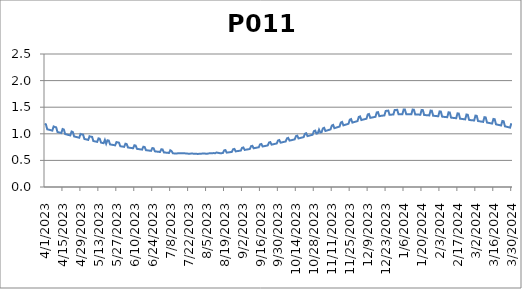
| Category | P011 |
|---|---|
| 4/1/23 | 1.185 |
| 4/2/23 | 1.178 |
| 4/3/23 | 1.085 |
| 4/4/23 | 1.079 |
| 4/5/23 | 1.073 |
| 4/6/23 | 1.066 |
| 4/7/23 | 1.06 |
| 4/8/23 | 1.138 |
| 4/9/23 | 1.128 |
| 4/10/23 | 1.121 |
| 4/11/23 | 1.034 |
| 4/12/23 | 1.028 |
| 4/13/23 | 1.021 |
| 4/14/23 | 1.015 |
| 4/15/23 | 1.09 |
| 4/16/23 | 1.08 |
| 4/17/23 | 0.995 |
| 4/18/23 | 0.989 |
| 4/19/23 | 0.982 |
| 4/20/23 | 0.976 |
| 4/21/23 | 0.969 |
| 4/22/23 | 1.043 |
| 4/23/23 | 1.033 |
| 4/24/23 | 0.951 |
| 4/25/23 | 0.944 |
| 4/26/23 | 0.938 |
| 4/27/23 | 0.932 |
| 4/28/23 | 0.926 |
| 4/29/23 | 0.997 |
| 4/30/23 | 0.988 |
| 5/1/23 | 0.984 |
| 5/2/23 | 0.902 |
| 5/3/23 | 0.897 |
| 5/4/23 | 0.891 |
| 5/5/23 | 0.885 |
| 5/6/23 | 0.954 |
| 5/7/23 | 0.946 |
| 5/8/23 | 0.942 |
| 5/9/23 | 0.864 |
| 5/10/23 | 0.859 |
| 5/11/23 | 0.853 |
| 5/12/23 | 0.848 |
| 5/13/23 | 0.914 |
| 5/14/23 | 0.907 |
| 5/15/23 | 0.833 |
| 5/16/23 | 0.828 |
| 5/17/23 | 0.824 |
| 5/18/23 | 0.886 |
| 5/19/23 | 0.814 |
| 5/20/23 | 0.878 |
| 5/21/23 | 0.873 |
| 5/22/23 | 0.801 |
| 5/23/23 | 0.796 |
| 5/24/23 | 0.792 |
| 5/25/23 | 0.788 |
| 5/26/23 | 0.783 |
| 5/27/23 | 0.844 |
| 5/28/23 | 0.838 |
| 5/29/23 | 0.833 |
| 5/30/23 | 0.767 |
| 5/31/23 | 0.763 |
| 6/1/23 | 0.758 |
| 6/2/23 | 0.755 |
| 6/3/23 | 0.813 |
| 6/4/23 | 0.807 |
| 6/5/23 | 0.743 |
| 6/6/23 | 0.739 |
| 6/7/23 | 0.735 |
| 6/8/23 | 0.731 |
| 6/9/23 | 0.728 |
| 6/10/23 | 0.784 |
| 6/11/23 | 0.779 |
| 6/12/23 | 0.717 |
| 6/13/23 | 0.713 |
| 6/14/23 | 0.71 |
| 6/15/23 | 0.706 |
| 6/16/23 | 0.703 |
| 6/17/23 | 0.757 |
| 6/18/23 | 0.752 |
| 6/19/23 | 0.692 |
| 6/20/23 | 0.689 |
| 6/21/23 | 0.686 |
| 6/22/23 | 0.683 |
| 6/23/23 | 0.679 |
| 6/24/23 | 0.732 |
| 6/25/23 | 0.727 |
| 6/26/23 | 0.67 |
| 6/27/23 | 0.667 |
| 6/28/23 | 0.664 |
| 6/29/23 | 0.661 |
| 6/30/23 | 0.658 |
| 7/1/23 | 0.71 |
| 7/2/23 | 0.706 |
| 7/3/23 | 0.65 |
| 7/4/23 | 0.647 |
| 7/5/23 | 0.645 |
| 7/6/23 | 0.643 |
| 7/7/23 | 0.64 |
| 7/8/23 | 0.691 |
| 7/9/23 | 0.676 |
| 7/10/23 | 0.634 |
| 7/11/23 | 0.631 |
| 7/12/23 | 0.629 |
| 7/13/23 | 0.628 |
| 7/14/23 | 0.636 |
| 7/15/23 | 0.634 |
| 7/16/23 | 0.632 |
| 7/17/23 | 0.635 |
| 7/18/23 | 0.634 |
| 7/19/23 | 0.633 |
| 7/20/23 | 0.632 |
| 7/21/23 | 0.631 |
| 7/22/23 | 0.625 |
| 7/23/23 | 0.625 |
| 7/24/23 | 0.628 |
| 7/25/23 | 0.628 |
| 7/26/23 | 0.627 |
| 7/27/23 | 0.627 |
| 7/28/23 | 0.627 |
| 7/29/23 | 0.622 |
| 7/30/23 | 0.623 |
| 7/31/23 | 0.627 |
| 8/1/23 | 0.627 |
| 8/2/23 | 0.628 |
| 8/3/23 | 0.628 |
| 8/4/23 | 0.629 |
| 8/5/23 | 0.625 |
| 8/6/23 | 0.627 |
| 8/7/23 | 0.632 |
| 8/8/23 | 0.633 |
| 8/9/23 | 0.634 |
| 8/10/23 | 0.636 |
| 8/11/23 | 0.638 |
| 8/12/23 | 0.634 |
| 8/13/23 | 0.649 |
| 8/14/23 | 0.643 |
| 8/15/23 | 0.64 |
| 8/16/23 | 0.634 |
| 8/17/23 | 0.636 |
| 8/18/23 | 0.639 |
| 8/19/23 | 0.689 |
| 8/20/23 | 0.694 |
| 8/21/23 | 0.647 |
| 8/22/23 | 0.65 |
| 8/23/23 | 0.653 |
| 8/24/23 | 0.656 |
| 8/25/23 | 0.659 |
| 8/26/23 | 0.71 |
| 8/27/23 | 0.716 |
| 8/28/23 | 0.67 |
| 8/29/23 | 0.673 |
| 8/30/23 | 0.677 |
| 8/31/23 | 0.681 |
| 9/1/23 | 0.685 |
| 9/2/23 | 0.736 |
| 9/3/23 | 0.743 |
| 9/4/23 | 0.697 |
| 9/5/23 | 0.701 |
| 9/6/23 | 0.706 |
| 9/7/23 | 0.71 |
| 9/8/23 | 0.715 |
| 9/9/23 | 0.767 |
| 9/10/23 | 0.774 |
| 9/11/23 | 0.728 |
| 9/12/23 | 0.733 |
| 9/13/23 | 0.737 |
| 9/14/23 | 0.742 |
| 9/15/23 | 0.747 |
| 9/16/23 | 0.8 |
| 9/17/23 | 0.808 |
| 9/18/23 | 0.761 |
| 9/19/23 | 0.766 |
| 9/20/23 | 0.771 |
| 9/21/23 | 0.776 |
| 9/22/23 | 0.782 |
| 9/23/23 | 0.836 |
| 9/24/23 | 0.844 |
| 9/25/23 | 0.797 |
| 9/26/23 | 0.802 |
| 9/27/23 | 0.807 |
| 9/28/23 | 0.813 |
| 9/29/23 | 0.818 |
| 9/30/23 | 0.874 |
| 10/1/23 | 0.883 |
| 10/2/23 | 0.834 |
| 10/3/23 | 0.839 |
| 10/4/23 | 0.845 |
| 10/5/23 | 0.85 |
| 10/6/23 | 0.856 |
| 10/7/23 | 0.914 |
| 10/8/23 | 0.923 |
| 10/9/23 | 0.872 |
| 10/10/23 | 0.878 |
| 10/11/23 | 0.884 |
| 10/12/23 | 0.89 |
| 10/13/23 | 0.895 |
| 10/14/23 | 0.956 |
| 10/15/23 | 0.966 |
| 10/16/23 | 0.913 |
| 10/17/23 | 0.919 |
| 10/18/23 | 0.925 |
| 10/19/23 | 0.931 |
| 10/20/23 | 0.938 |
| 10/21/23 | 1.001 |
| 10/22/23 | 1.011 |
| 10/23/23 | 0.957 |
| 10/24/23 | 0.963 |
| 10/25/23 | 0.97 |
| 10/26/23 | 0.976 |
| 10/27/23 | 0.983 |
| 10/28/23 | 1.049 |
| 10/29/23 | 1.06 |
| 10/30/23 | 1.003 |
| 10/31/23 | 1.01 |
| 11/1/23 | 1.078 |
| 11/2/23 | 1.024 |
| 11/3/23 | 1.032 |
| 11/4/23 | 1.101 |
| 11/5/23 | 1.112 |
| 11/6/23 | 1.053 |
| 11/7/23 | 1.06 |
| 11/8/23 | 1.068 |
| 11/9/23 | 1.076 |
| 11/10/23 | 1.083 |
| 11/11/23 | 1.155 |
| 11/12/23 | 1.167 |
| 11/13/23 | 1.106 |
| 11/14/23 | 1.113 |
| 11/15/23 | 1.121 |
| 11/16/23 | 1.128 |
| 11/17/23 | 1.136 |
| 11/18/23 | 1.21 |
| 11/19/23 | 1.222 |
| 11/20/23 | 1.159 |
| 11/21/23 | 1.166 |
| 11/22/23 | 1.174 |
| 11/23/23 | 1.181 |
| 11/24/23 | 1.189 |
| 11/25/23 | 1.266 |
| 11/26/23 | 1.277 |
| 11/27/23 | 1.211 |
| 11/28/23 | 1.218 |
| 11/29/23 | 1.225 |
| 11/30/23 | 1.232 |
| 12/1/23 | 1.238 |
| 12/2/23 | 1.318 |
| 12/3/23 | 1.327 |
| 12/4/23 | 1.258 |
| 12/5/23 | 1.265 |
| 12/6/23 | 1.271 |
| 12/7/23 | 1.277 |
| 12/8/23 | 1.283 |
| 12/9/23 | 1.364 |
| 12/10/23 | 1.372 |
| 12/11/23 | 1.299 |
| 12/12/23 | 1.305 |
| 12/13/23 | 1.31 |
| 12/14/23 | 1.315 |
| 12/15/23 | 1.319 |
| 12/16/23 | 1.402 |
| 12/17/23 | 1.407 |
| 12/18/23 | 1.332 |
| 12/19/23 | 1.336 |
| 12/20/23 | 1.34 |
| 12/21/23 | 1.343 |
| 12/22/23 | 1.346 |
| 12/23/23 | 1.43 |
| 12/24/23 | 1.433 |
| 12/25/23 | 1.436 |
| 12/26/23 | 1.357 |
| 12/27/23 | 1.359 |
| 12/28/23 | 1.361 |
| 12/29/23 | 1.362 |
| 12/30/23 | 1.447 |
| 12/31/23 | 1.449 |
| 1/1/24 | 1.451 |
| 1/2/24 | 1.367 |
| 1/3/24 | 1.368 |
| 1/4/24 | 1.369 |
| 1/5/24 | 1.369 |
| 1/6/24 | 1.456 |
| 1/7/24 | 1.455 |
| 1/8/24 | 1.369 |
| 1/9/24 | 1.369 |
| 1/10/24 | 1.369 |
| 1/11/24 | 1.368 |
| 1/12/24 | 1.367 |
| 1/13/24 | 1.455 |
| 1/14/24 | 1.453 |
| 1/15/24 | 1.364 |
| 1/16/24 | 1.363 |
| 1/17/24 | 1.362 |
| 1/18/24 | 1.36 |
| 1/19/24 | 1.359 |
| 1/20/24 | 1.448 |
| 1/21/24 | 1.445 |
| 1/22/24 | 1.354 |
| 1/23/24 | 1.352 |
| 1/24/24 | 1.35 |
| 1/25/24 | 1.348 |
| 1/26/24 | 1.346 |
| 1/27/24 | 1.436 |
| 1/28/24 | 1.433 |
| 1/29/24 | 1.339 |
| 1/30/24 | 1.337 |
| 1/31/24 | 1.334 |
| 2/1/24 | 1.332 |
| 2/2/24 | 1.33 |
| 2/3/24 | 1.421 |
| 2/4/24 | 1.418 |
| 2/5/24 | 1.322 |
| 2/6/24 | 1.32 |
| 2/7/24 | 1.317 |
| 2/8/24 | 1.315 |
| 2/9/24 | 1.312 |
| 2/10/24 | 1.404 |
| 2/11/24 | 1.4 |
| 2/12/24 | 1.304 |
| 2/13/24 | 1.301 |
| 2/14/24 | 1.298 |
| 2/15/24 | 1.295 |
| 2/16/24 | 1.292 |
| 2/17/24 | 1.385 |
| 2/18/24 | 1.38 |
| 2/19/24 | 1.283 |
| 2/20/24 | 1.281 |
| 2/21/24 | 1.278 |
| 2/22/24 | 1.274 |
| 2/23/24 | 1.271 |
| 2/24/24 | 1.363 |
| 2/25/24 | 1.357 |
| 2/26/24 | 1.261 |
| 2/27/24 | 1.258 |
| 2/28/24 | 1.254 |
| 2/29/24 | 1.253 |
| 3/1/24 | 1.251 |
| 3/2/24 | 1.342 |
| 3/3/24 | 1.338 |
| 3/4/24 | 1.24 |
| 3/5/24 | 1.236 |
| 3/6/24 | 1.232 |
| 3/7/24 | 1.228 |
| 3/8/24 | 1.224 |
| 3/9/24 | 1.313 |
| 3/10/24 | 1.308 |
| 3/11/24 | 1.211 |
| 3/12/24 | 1.207 |
| 3/13/24 | 1.202 |
| 3/14/24 | 1.197 |
| 3/15/24 | 1.193 |
| 3/16/24 | 1.279 |
| 3/17/24 | 1.274 |
| 3/18/24 | 1.178 |
| 3/19/24 | 1.173 |
| 3/20/24 | 1.167 |
| 3/21/24 | 1.162 |
| 3/22/24 | 1.157 |
| 3/23/24 | 1.241 |
| 3/24/24 | 1.235 |
| 3/25/24 | 1.14 |
| 3/26/24 | 1.134 |
| 3/27/24 | 1.128 |
| 3/28/24 | 1.122 |
| 3/29/24 | 1.116 |
| 3/30/24 | 1.198 |